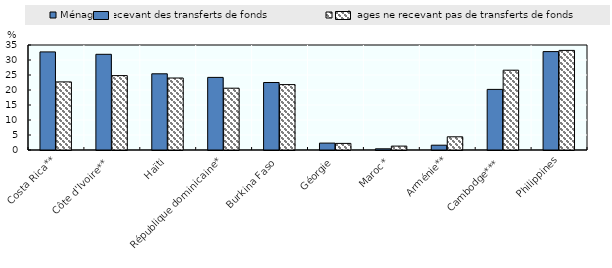
| Category | Ménages recevant des transferts de fonds | Ménages ne recevant pas de transferts de fonds |
|---|---|---|
| Costa Rica** | 32.7 | 22.7 |
| Côte d'Ivoire** | 31.9 | 24.8 |
| Haïti | 25.4 | 24 |
| République dominicaine* | 24.2 | 20.6 |
| Burkina Faso | 22.5 | 21.8 |
| Géorgie | 2.3 | 2.2 |
| Maroc* | 0.4 | 1.3 |
| Arménie** | 1.6 | 4.4 |
| Cambodge*** | 20.2 | 26.6 |
| Philippines | 32.8 | 33.2 |